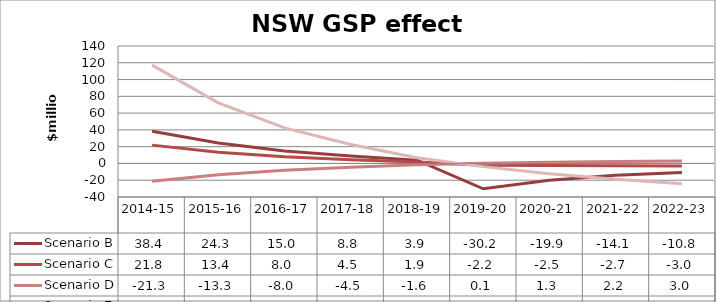
| Category | Scenario B | Scenario C | Scenario D | Scenario E |
|---|---|---|---|---|
| 2014-15 | 38.36 | 21.837 | -21.306 | 117.207 |
| 2015-16 | 24.262 | 13.44 | -13.342 | 72.233 |
| 2016-17 | 14.964 | 8.038 | -7.989 | 42.353 |
| 2017-18 | 8.811 | 4.51 | -4.459 | 22.638 |
| 2018-19 | 3.934 | 1.862 | -1.598 | 6.749 |
| 2019-20 | -30.23 | -2.165 | 0.101 | -3.784 |
| 2020-21 | -19.918 | -2.497 | 1.327 | -12.385 |
| 2021-22 | -14.094 | -2.731 | 2.215 | -18.737 |
| 2022-23 | -10.825 | -3.033 | 2.971 | -24.172 |